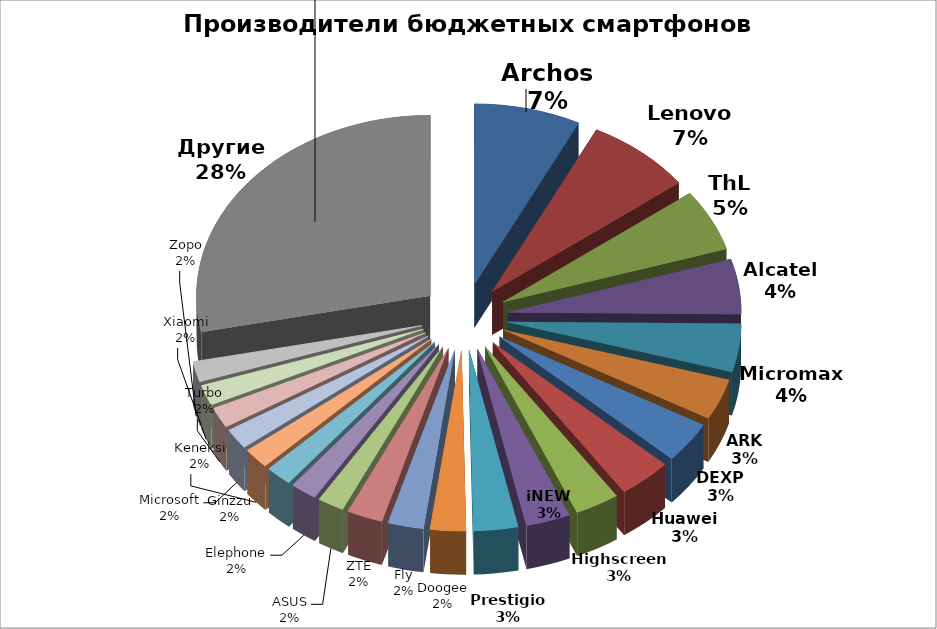
| Category | Series 0 |
|---|---|
| Archos | 12 |
| Lenovo | 12 |
| ThL | 9 |
| Alcatel | 8 |
| Micromax | 7 |
| ARK | 6 |
| DEXP | 6 |
| Huawei | 6 |
| Highscreen | 5 |
| iNEW | 5 |
| Prestigio | 5 |
| Doogee | 4 |
| Fly | 4 |
| ZTE | 4 |
| ASUS | 3 |
| Elephone | 3 |
| Ginzzu | 3 |
| Keneksi | 3 |
| Microsoft | 3 |
| Turbo | 3 |
| Xiaomi | 3 |
| ZOPO | 3 |
| Другие | 46 |